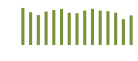
| Category | Saldo [ (1)-(2) ] |
|---|---|
| 0 | 329612.931 |
| 1 | 291358.085 |
| 2 | 266512.131 |
| 3 | 297562.723 |
| 4 | 310243.352 |
| 5 | 320714.531 |
| 6 | 286229.119 |
| 7 | 282809.198 |
| 8 | 306315.684 |
| 9 | 322195.815 |
| 10 | 306185.726 |
| 11 | 300797.708 |
| 12 | 287185.489 |
| 13 | 229607.519 |
| 14 | 262635.545 |